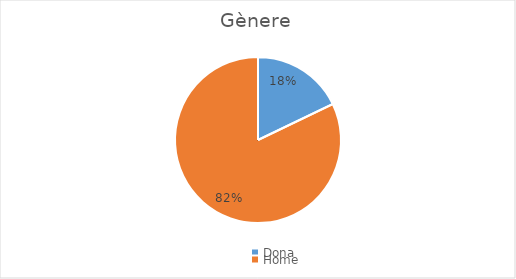
| Category | Series 0 |
|---|---|
| Dona | 15 |
| Home | 69 |